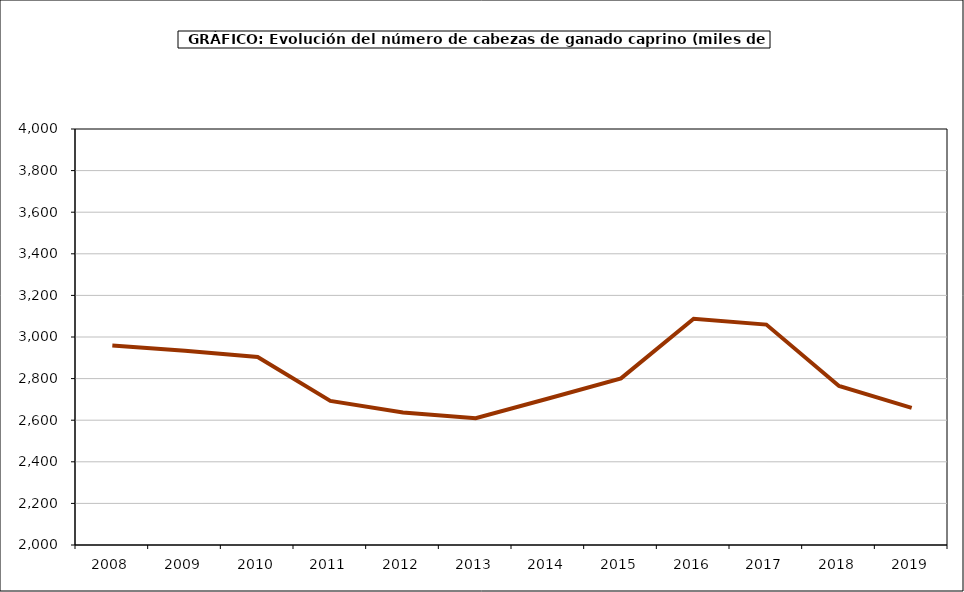
| Category | Total Ovino |
|---|---|
| 2008.0 | 2959.329 |
| 2009.0 | 2933.782 |
| 2010.0 | 2904 |
| 2011.0 | 2693 |
| 2012.0 | 2637.336 |
| 2013.0 | 2609.989 |
| 2014.0 | 2704.229 |
| 2015.0 | 2801.064 |
| 2016.0 | 3088.035 |
| 2017.0 | 3059.731 |
| 2018.0 | 2764.79 |
| 2019.0 | 2659 |